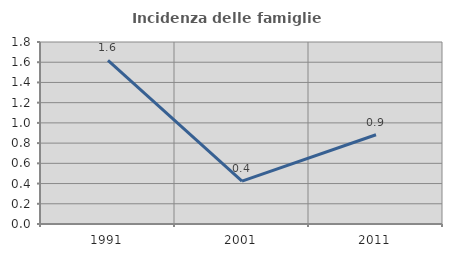
| Category | Incidenza delle famiglie numerose |
|---|---|
| 1991.0 | 1.617 |
| 2001.0 | 0.425 |
| 2011.0 | 0.883 |